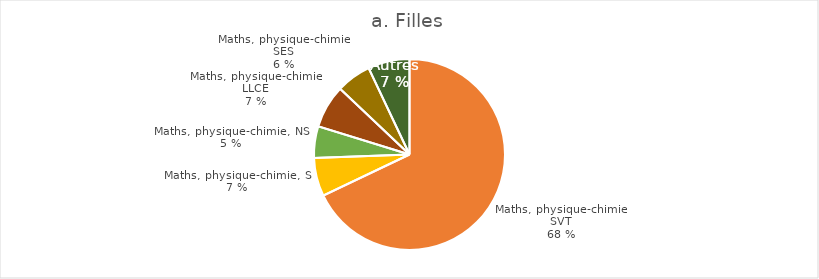
| Category | Filles |
|---|---|
| Mathématiques, physique-chimie, SVT | 17741 |
| Mathématiques, physique-chimie, SI | 1698 |
| Mathématiques, physique-chimie, NSI | 1392 |
| Mathématiques, physique-chimie, LLCER | 1908 |
| Mathématiques, physique-chimie, SES | 1541 |
| Autres | 1837 |